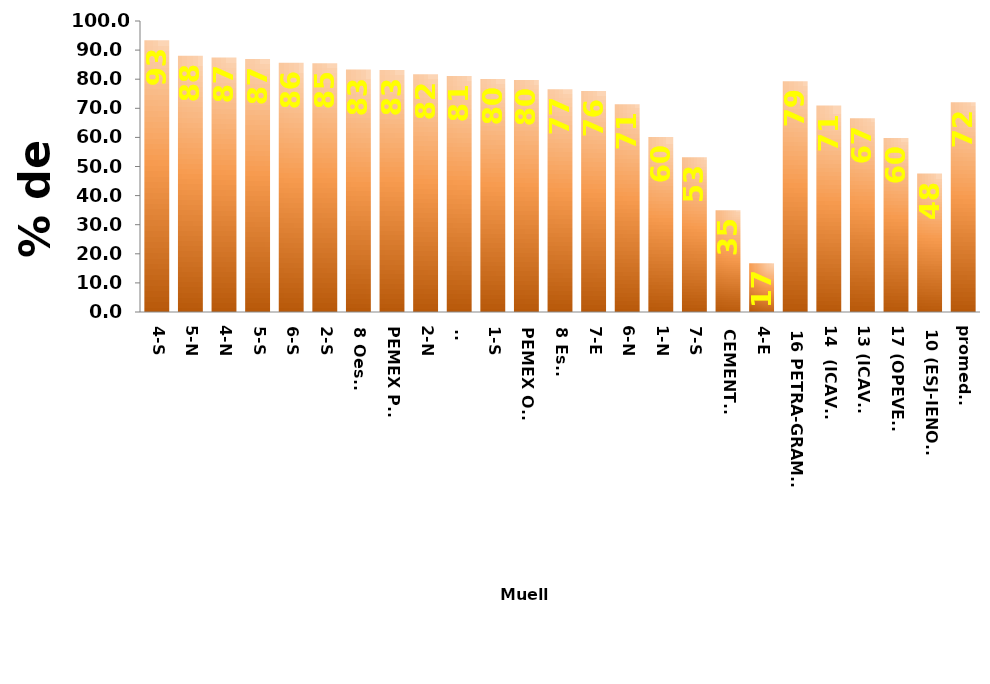
| Category | ene-ago 2023 |
|---|---|
| 4-S | 93.371 |
| 5-N | 88.05 |
| 4-N | 87.495 |
| 5-S | 86.923 |
| 6-S | 85.669 |
| 2-S | 85.465 |
| 8 Oeste | 83.329 |
| PEMEX PTE | 83.135 |
| 2-N | 81.68 |
| 9- | 81.074 |
| 1-S | 80.028 |
| PEMEX OTE | 79.709 |
| 8 Este | 76.533 |
| 7-E | 75.92 |
| 6-N | 71.375 |
| 1-N | 60.173 |
| 7-S | 53.183 |
| CEMENTOS | 34.944 |
| 4-E | 16.712 |
| 16 PETRA-GRAMOSA | 79.302 |
| 14  (ICAVE) | 70.928 |
| 13 (ICAVE) | 66.578 |
| 17 (OPEVER) | 59.756 |
| 10 (ESJ-IENOVA) | 47.587 |
| promedio | 72.087 |